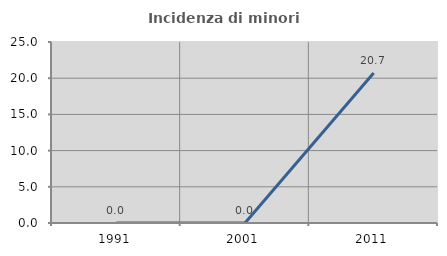
| Category | Incidenza di minori stranieri |
|---|---|
| 1991.0 | 0 |
| 2001.0 | 0 |
| 2011.0 | 20.721 |